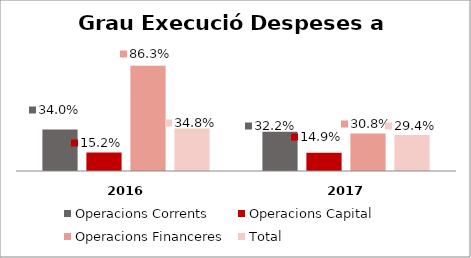
| Category | Operacions Corrents | Operacions Capital | Operacions Financeres | Total |
|---|---|---|---|---|
| 0 | 0.34 | 0.152 | 0.863 | 0.348 |
| 1 | 0.322 | 0.149 | 0.308 | 0.294 |